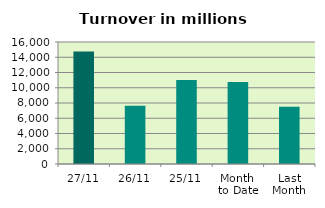
| Category | Series 0 |
|---|---|
| 27/11 | 14755.856 |
| 26/11 | 7625.266 |
| 25/11 | 11013.888 |
| Month 
to Date | 10739.762 |
| Last
Month | 7506.583 |